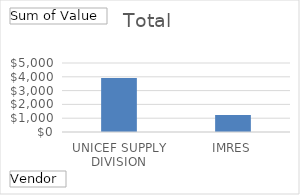
| Category | Total |
|---|---|
| UNICEF SUPPLY DIVISION | 3906 |
| IMRES | 1240 |